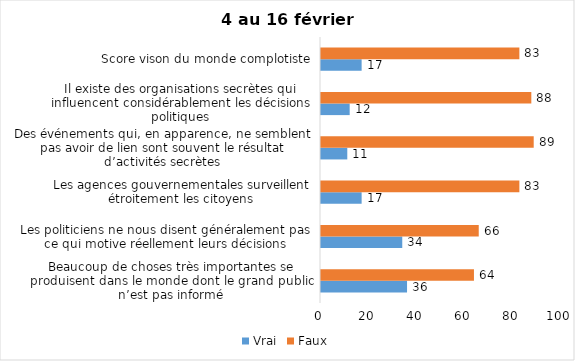
| Category | Vrai | Faux |
|---|---|---|
| Beaucoup de choses très importantes se produisent dans le monde dont le grand public n’est pas informé | 36 | 64 |
| Les politiciens ne nous disent généralement pas ce qui motive réellement leurs décisions | 34 | 66 |
| Les agences gouvernementales surveillent étroitement les citoyens | 17 | 83 |
| Des événements qui, en apparence, ne semblent pas avoir de lien sont souvent le résultat d’activités secrètes | 11 | 89 |
| Il existe des organisations secrètes qui influencent considérablement les décisions politiques | 12 | 88 |
| Score vison du monde complotiste | 17 | 83 |